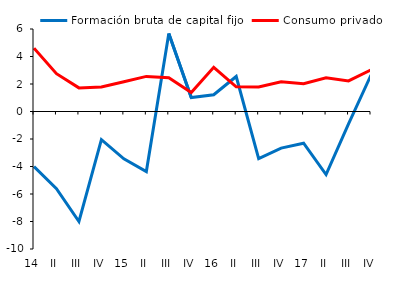
| Category | Formación bruta de capital fijo | Consumo privado |
|---|---|---|
| 14 | -4.008 | 4.608 |
| II | -5.616 | 2.749 |
| III | -8 | 1.718 |
| IV | -2.047 | 1.776 |
| 15 | -3.445 | 2.16 |
| II | -4.369 | 2.552 |
| III | 5.673 | 2.45 |
| IV | 1.01 | 1.384 |
| 16 | 1.219 | 3.214 |
| II | 2.546 | 1.793 |
| III | -3.431 | 1.784 |
| IV | -2.665 | 2.168 |
| 17 | -2.307 | 2.015 |
| II | -4.583 | 2.452 |
| III | -0.894 | 2.224 |
| IV | 2.654 | 3.025 |